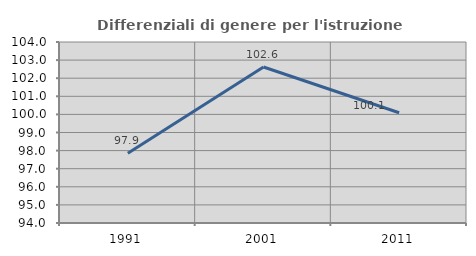
| Category | Differenziali di genere per l'istruzione superiore |
|---|---|
| 1991.0 | 97.854 |
| 2001.0 | 102.618 |
| 2011.0 | 100.089 |